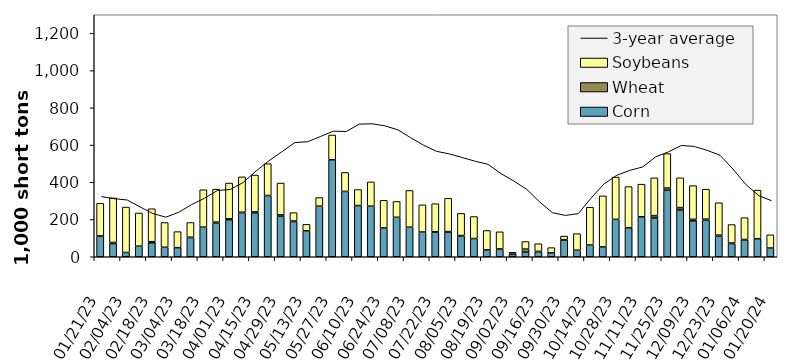
| Category | Corn | Wheat | Soybeans |
|---|---|---|---|
| 2023-01-21 | 110 | 2 | 175 |
| 2023-01-28 | 71 | 6 | 239 |
| 2023-02-04 | 23 | 0 | 244 |
| 2023-02-11 | 57 | 0 | 178 |
| 2023-02-18 | 75 | 6 | 177 |
| 2023-02-25 | 51 | 0 | 133 |
| 2023-03-04 | 49 | 0 | 86 |
| 2023-03-11 | 103 | 2 | 79 |
| 2023-03-18 | 159 | 0 | 201 |
| 2023-03-25 | 181 | 5 | 177 |
| 2023-04-01 | 199 | 5 | 192 |
| 2023-04-08 | 237 | 2 | 190 |
| 2023-04-15 | 236 | 5 | 198 |
| 2023-04-22 | 329 | 0 | 171 |
| 2023-04-29 | 217 | 8 | 171 |
| 2023-05-06 | 189 | 3 | 45 |
| 2023-05-13 | 139 | 0 | 35 |
| 2023-05-20 | 272 | 0 | 46 |
| 2023-05-27 | 521 | 0 | 133 |
| 2023-06-03 | 351 | 0 | 102 |
| 2023-06-10 | 275 | 0 | 86 |
| 2023-06-17 | 272 | 0 | 130 |
| 2023-06-24 | 155 | 0 | 148 |
| 2023-07-01 | 212 | 0 | 85 |
| 2023-07-08 | 159 | 0 | 197 |
| 2023-07-15 | 133 | 0 | 146 |
| 2023-07-22 | 132 | 2 | 151 |
| 2023-07-29 | 133 | 2 | 179 |
| 2023-08-05 | 112 | 2 | 119 |
| 2023-08-12 | 98 | 0 | 118 |
| 2023-08-19 | 37 | 0 | 104 |
| 2023-08-26 | 40 | 2 | 92 |
| 2023-09-02 | 13 | 6 | 5 |
| 2023-09-09 | 25 | 16 | 41 |
| 2023-09-16 | 27 | 2 | 41 |
| 2023-09-23 | 21 | 0 | 28 |
| 2023-09-30 | 90 | 2 | 19 |
| 2023-10-07 | 35 | 0 | 89 |
| 2023-10-14 | 63 | 0 | 203 |
| 2023-10-21 | 53 | 0 | 274 |
| 2023-10-28 | 201 | 0 | 227 |
| 2023-11-04 | 156 | 0 | 221 |
| 2023-11-11 | 215 | 0 | 175 |
| 2023-11-18 | 208 | 13 | 203 |
| 2023-11-25 | 357 | 12 | 185 |
| 2023-12-02 | 251 | 13 | 160 |
| 2023-12-09 | 193 | 8 | 181 |
| 2023-12-16 | 197 | 5 | 161 |
| 2023-12-23 | 111 | 5 | 174 |
| 2023-12-30 | 71 | 3 | 99 |
| 2024-01-06 | 91 | 2 | 117 |
| 2024-01-13 | 97 | 0 | 261 |
| 2024-01-20 | 47 | 0 | 71 |